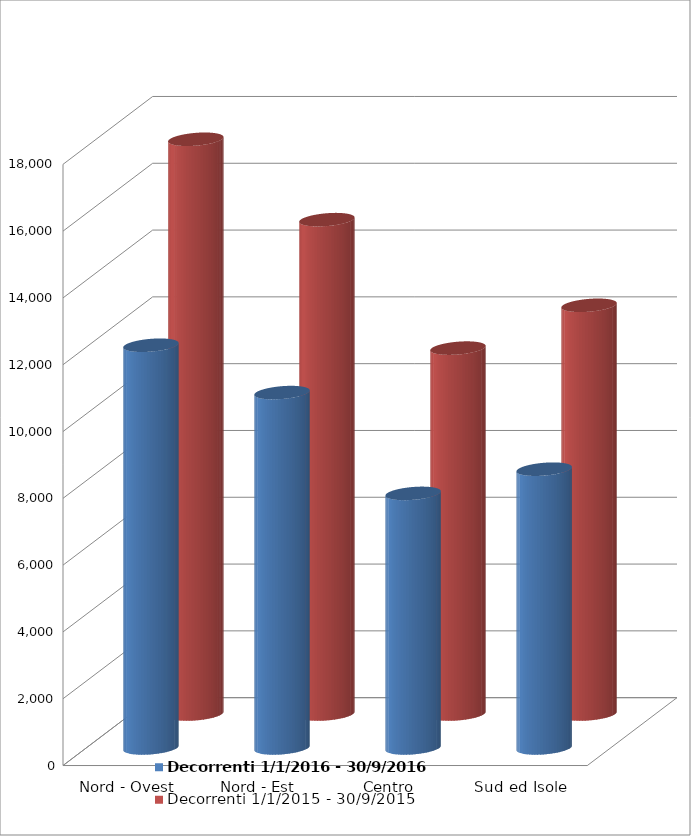
| Category | Decorrenti 1/1/2016 - 30/9/2016 | Decorrenti 1/1/2015 - 30/9/2015 |
|---|---|---|
| Nord - Ovest | 12058 | 17209 |
| Nord - Est | 10640 | 14802 |
| Centro | 7622 | 10956 |
| Sud ed Isole | 8347 | 12238 |